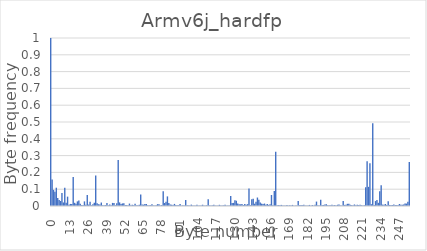
| Category | Series 0 |
|---|---|
| 0.0 | 1 |
| 1.0 | 0.157 |
| 2.0 | 0.096 |
| 3.0 | 0.085 |
| 4.0 | 0.109 |
| 5.0 | 0.047 |
| 6.0 | 0.035 |
| 7.0 | 0.03 |
| 8.0 | 0.078 |
| 9.0 | 0.021 |
| 10.0 | 0.108 |
| 11.0 | 0.02 |
| 12.0 | 0.056 |
| 13.0 | 0.008 |
| 14.0 | 0.012 |
| 15.0 | 0.011 |
| 16.0 | 0.172 |
| 17.0 | 0.019 |
| 18.0 | 0.014 |
| 19.0 | 0.027 |
| 20.0 | 0.033 |
| 21.0 | 0.013 |
| 22.0 | 0.006 |
| 23.0 | 0.006 |
| 24.0 | 0.027 |
| 25.0 | 0.008 |
| 26.0 | 0.065 |
| 27.0 | 0.008 |
| 28.0 | 0.025 |
| 29.0 | 0.004 |
| 30.0 | 0.011 |
| 31.0 | 0.019 |
| 32.0 | 0.181 |
| 33.0 | 0.016 |
| 34.0 | 0.011 |
| 35.0 | 0.01 |
| 36.0 | 0.021 |
| 37.0 | 0.005 |
| 38.0 | 0.004 |
| 39.0 | 0.005 |
| 40.0 | 0.018 |
| 41.0 | 0.004 |
| 42.0 | 0.008 |
| 43.0 | 0.004 |
| 44.0 | 0.018 |
| 45.0 | 0.019 |
| 46.0 | 0.005 |
| 47.0 | 0.016 |
| 48.0 | 0.274 |
| 49.0 | 0.021 |
| 50.0 | 0.012 |
| 51.0 | 0.015 |
| 52.0 | 0.017 |
| 53.0 | 0.007 |
| 54.0 | 0.005 |
| 55.0 | 0.005 |
| 56.0 | 0.014 |
| 57.0 | 0.004 |
| 58.0 | 0.008 |
| 59.0 | 0.005 |
| 60.0 | 0.013 |
| 61.0 | 0.004 |
| 62.0 | 0.005 |
| 63.0 | 0.007 |
| 64.0 | 0.069 |
| 65.0 | 0.009 |
| 66.0 | 0.008 |
| 67.0 | 0.012 |
| 68.0 | 0.012 |
| 69.0 | 0.004 |
| 70.0 | 0.004 |
| 71.0 | 0.005 |
| 72.0 | 0.011 |
| 73.0 | 0.003 |
| 74.0 | 0.003 |
| 75.0 | 0.005 |
| 76.0 | 0.011 |
| 77.0 | 0.01 |
| 78.0 | 0.003 |
| 79.0 | 0.006 |
| 80.0 | 0.088 |
| 81.0 | 0.018 |
| 82.0 | 0.026 |
| 83.0 | 0.057 |
| 84.0 | 0.018 |
| 85.0 | 0.01 |
| 86.0 | 0.008 |
| 87.0 | 0.006 |
| 88.0 | 0.012 |
| 89.0 | 0.005 |
| 90.0 | 0.005 |
| 91.0 | 0.005 |
| 92.0 | 0.012 |
| 93.0 | 0.002 |
| 94.0 | 0.004 |
| 95.0 | 0.003 |
| 96.0 | 0.036 |
| 97.0 | 0.004 |
| 98.0 | 0.003 |
| 99.0 | 0.003 |
| 100.0 | 0.008 |
| 101.0 | 0.002 |
| 102.0 | 0.003 |
| 103.0 | 0.002 |
| 104.0 | 0.008 |
| 105.0 | 0.002 |
| 106.0 | 0.003 |
| 107.0 | 0.003 |
| 108.0 | 0.008 |
| 109.0 | 0.002 |
| 110.0 | 0.003 |
| 111.0 | 0.005 |
| 112.0 | 0.04 |
| 113.0 | 0.004 |
| 114.0 | 0.004 |
| 115.0 | 0.004 |
| 116.0 | 0.008 |
| 117.0 | 0.002 |
| 118.0 | 0.002 |
| 119.0 | 0.002 |
| 120.0 | 0.007 |
| 121.0 | 0.002 |
| 122.0 | 0.003 |
| 123.0 | 0.004 |
| 124.0 | 0.007 |
| 125.0 | 0.002 |
| 126.0 | 0.003 |
| 127.0 | 0.003 |
| 128.0 | 0.059 |
| 129.0 | 0.018 |
| 130.0 | 0.018 |
| 131.0 | 0.034 |
| 132.0 | 0.031 |
| 133.0 | 0.015 |
| 134.0 | 0.01 |
| 135.0 | 0.01 |
| 136.0 | 0.011 |
| 137.0 | 0.006 |
| 138.0 | 0.012 |
| 139.0 | 0.007 |
| 140.0 | 0.011 |
| 141.0 | 0.104 |
| 142.0 | 0.005 |
| 143.0 | 0.041 |
| 144.0 | 0.044 |
| 145.0 | 0.014 |
| 146.0 | 0.025 |
| 147.0 | 0.05 |
| 148.0 | 0.037 |
| 149.0 | 0.02 |
| 150.0 | 0.014 |
| 151.0 | 0.011 |
| 152.0 | 0.015 |
| 153.0 | 0.008 |
| 154.0 | 0.012 |
| 155.0 | 0.007 |
| 156.0 | 0.01 |
| 157.0 | 0.066 |
| 158.0 | 0.004 |
| 159.0 | 0.09 |
| 160.0 | 0.322 |
| 161.0 | 0.004 |
| 162.0 | 0.005 |
| 163.0 | 0.005 |
| 164.0 | 0.007 |
| 165.0 | 0.003 |
| 166.0 | 0.002 |
| 167.0 | 0.002 |
| 168.0 | 0.006 |
| 169.0 | 0.002 |
| 170.0 | 0.004 |
| 171.0 | 0.002 |
| 172.0 | 0.007 |
| 173.0 | 0.002 |
| 174.0 | 0.003 |
| 175.0 | 0.002 |
| 176.0 | 0.03 |
| 177.0 | 0.005 |
| 178.0 | 0.005 |
| 179.0 | 0.005 |
| 180.0 | 0.008 |
| 181.0 | 0.003 |
| 182.0 | 0.003 |
| 183.0 | 0.002 |
| 184.0 | 0.006 |
| 185.0 | 0.002 |
| 186.0 | 0.007 |
| 187.0 | 0.002 |
| 188.0 | 0.007 |
| 189.0 | 0.026 |
| 190.0 | 0.004 |
| 191.0 | 0.004 |
| 192.0 | 0.037 |
| 193.0 | 0.007 |
| 194.0 | 0.006 |
| 195.0 | 0.008 |
| 196.0 | 0.01 |
| 197.0 | 0.005 |
| 198.0 | 0.004 |
| 199.0 | 0.004 |
| 200.0 | 0.007 |
| 201.0 | 0.004 |
| 202.0 | 0.006 |
| 203.0 | 0.004 |
| 204.0 | 0.007 |
| 205.0 | 0.008 |
| 206.0 | 0.003 |
| 207.0 | 0.003 |
| 208.0 | 0.03 |
| 209.0 | 0.007 |
| 210.0 | 0.007 |
| 211.0 | 0.013 |
| 212.0 | 0.013 |
| 213.0 | 0.007 |
| 214.0 | 0.005 |
| 215.0 | 0.005 |
| 216.0 | 0.009 |
| 217.0 | 0.005 |
| 218.0 | 0.008 |
| 219.0 | 0.005 |
| 220.0 | 0.008 |
| 221.0 | 0.005 |
| 222.0 | 0.004 |
| 223.0 | 0.004 |
| 224.0 | 0.112 |
| 225.0 | 0.266 |
| 226.0 | 0.114 |
| 227.0 | 0.255 |
| 228.0 | 0.011 |
| 229.0 | 0.493 |
| 230.0 | 0.006 |
| 231.0 | 0.029 |
| 232.0 | 0.035 |
| 233.0 | 0.019 |
| 234.0 | 0.088 |
| 235.0 | 0.124 |
| 236.0 | 0.008 |
| 237.0 | 0.007 |
| 238.0 | 0.012 |
| 239.0 | 0.006 |
| 240.0 | 0.028 |
| 241.0 | 0.006 |
| 242.0 | 0.005 |
| 243.0 | 0.006 |
| 244.0 | 0.008 |
| 245.0 | 0.005 |
| 246.0 | 0.005 |
| 247.0 | 0.006 |
| 248.0 | 0.012 |
| 249.0 | 0.008 |
| 250.0 | 0.008 |
| 251.0 | 0.009 |
| 252.0 | 0.014 |
| 253.0 | 0.014 |
| 254.0 | 0.025 |
| 255.0 | 0.262 |